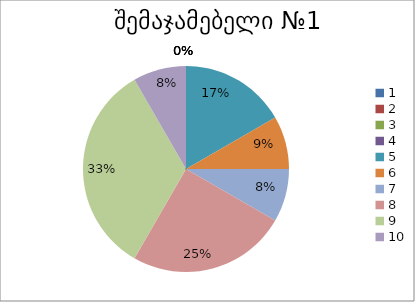
| Category | Series 1 |
|---|---|
| 0 | 0 |
| 1 | 0 |
| 2 | 0 |
| 3 | 0 |
| 4 | 2 |
| 5 | 1 |
| 6 | 1 |
| 7 | 3 |
| 8 | 4 |
| 9 | 1 |